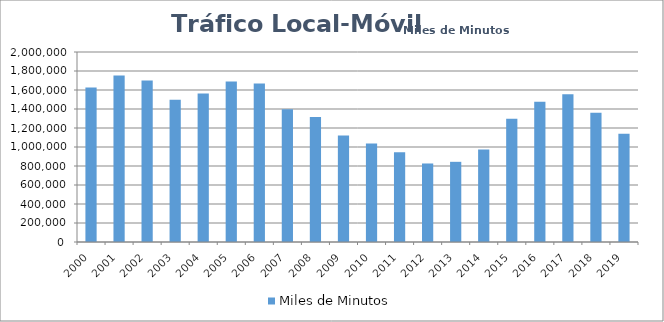
| Category | Miles de Minutos |
|---|---|
| 2000 | 1627028 |
| 2001 | 1752982 |
| 2002 | 1700120 |
| 2003 | 1497591 |
| 2004 | 1562293 |
| 2005 | 1690428 |
| 2006 | 1668463.423 |
| 2007 | 1397811.019 |
| 2008 | 1314507.034 |
| 2009 | 1120321.35 |
| 2010 | 1037043.938 |
| 2011 | 944322.029 |
| 2012 | 826511.145 |
| 2013 | 844044.583 |
| 2014 | 973602.636 |
| 2015 | 1296335.952 |
| 2016 | 1477242.661 |
| 2017 | 1554908.525 |
| 2018 | 1360456.758 |
| 2019 | 1139436.766 |